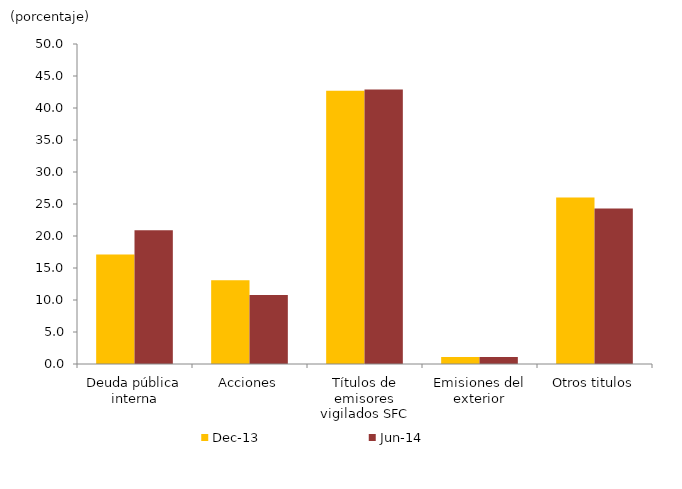
| Category | dic-13 | jun-14 |
|---|---|---|
| Deuda pública interna | 17.1 | 20.9 |
| Acciones | 13.1 | 10.8 |
| Títulos de emisores vigilados SFC | 42.7 | 42.9 |
| Emisiones del exterior | 1.1 | 1.1 |
| Otros titulos | 26 | 24.3 |